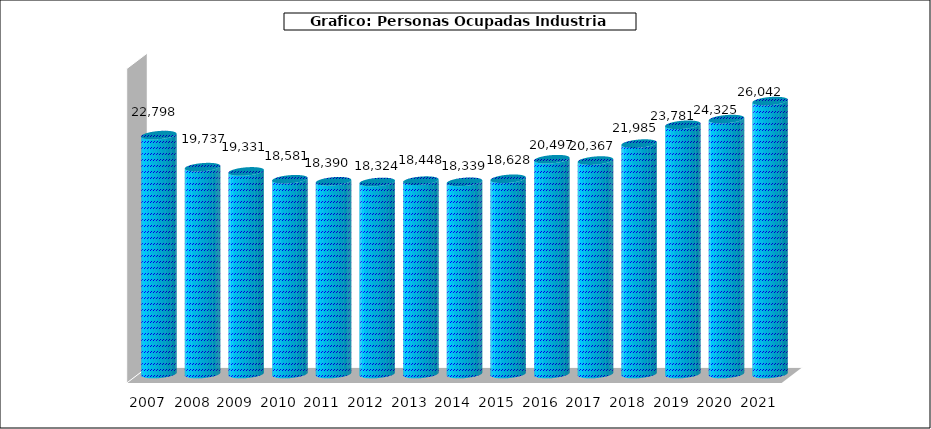
| Category |  Nº Personas Ocupadas Industria Pesquera |
|---|---|
| 2007 | 22798 |
| 2008 * | 19737 |
| 2009 | 19331 |
| 2010 | 18581 |
| 2011 | 18390 |
| 2012 | 18324 |
| 2013 | 18448 |
| 2014 | 18339 |
| 2015 | 18628 |
| 2016 | 20497 |
| 2017 | 20367 |
| 2018 | 21985 |
| 2019 | 23781 |
| 2020 | 24325 |
| 2021 | 26042 |